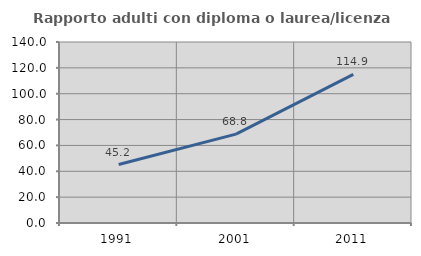
| Category | Rapporto adulti con diploma o laurea/licenza media  |
|---|---|
| 1991.0 | 45.221 |
| 2001.0 | 68.774 |
| 2011.0 | 114.93 |